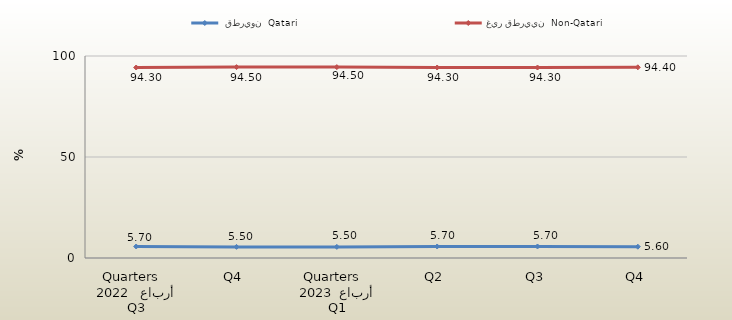
| Category |   قطريون  Qatari  |  غير قطريين  Non-Qatari  |
|---|---|---|
| 0 | 5.7 | 94.3 |
| 1 | 5.5 | 94.5 |
| 2 | 5.5 | 94.5 |
| 3 | 5.7 | 94.3 |
| 4 | 5.7 | 94.3 |
| 5 | 5.6 | 94.4 |